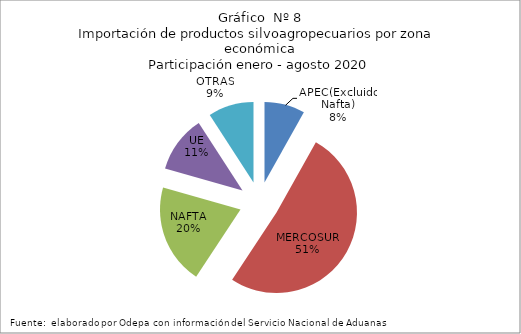
| Category | Series 0 |
|---|---|
| APEC(Excluido Nafta) | 337163.696 |
| MERCOSUR | 2120181.332 |
| NAFTA | 833176.059 |
| UE | 475210.746 |
| OTRAS | 378913.166 |